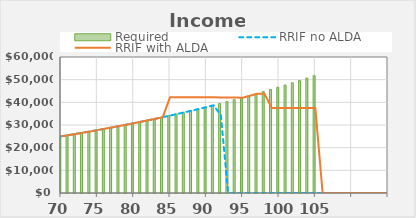
| Category |  Required |
|---|---|
| 70 | 25000 |
| 71 | 25525 |
| 72 | 26061.025 |
| 73 | 26608.307 |
| 74 | 27167.081 |
| 75 | 27737.59 |
| 76 | 28320.079 |
| 77 | 28914.801 |
| 78 | 29522.012 |
| 79 | 30141.974 |
| 80 | 30774.955 |
| 81 | 31421.229 |
| 82 | 32081.075 |
| 83 | 32754.778 |
| 84 | 33442.628 |
| 85 | 34144.923 |
| 86 | 34861.967 |
| 87 | 35594.068 |
| 88 | 36341.543 |
| 89 | 37104.716 |
| 90 | 37883.915 |
| 91 | 38679.477 |
| 92 | 39491.746 |
| 93 | 40321.073 |
| 94 | 41167.815 |
| 95 | 42032.339 |
| 96 | 42915.018 |
| 97 | 43816.234 |
| 98 | 44736.375 |
| 99 | 45675.839 |
| 100 | 46635.031 |
| 101 | 47614.367 |
| 102 | 48614.269 |
| 103 | 49635.168 |
| 104 | 50677.507 |
| 105 | 51741.734 |